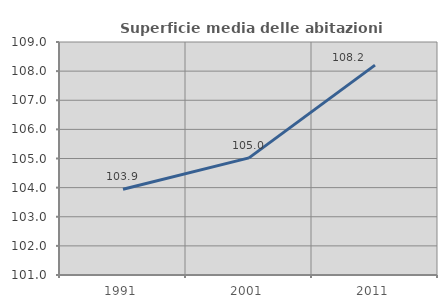
| Category | Superficie media delle abitazioni occupate |
|---|---|
| 1991.0 | 103.945 |
| 2001.0 | 105.022 |
| 2011.0 | 108.205 |